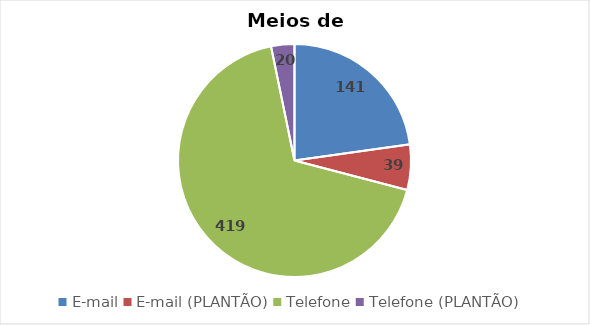
| Category | TOTAL GERAL  |
|---|---|
| E-mail | 141 |
| E-mail (PLANTÃO) | 39 |
| Telefone | 419 |
| Telefone (PLANTÃO) | 20 |